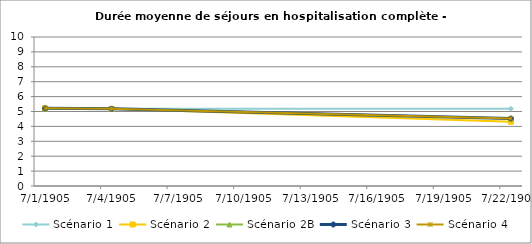
| Category | Scénario 1 | Scénario 2 | Scénario 2B | Scénario 3 | Scénario 4 |
|---|---|---|---|---|---|
| 2009.0 | 5.213 | 5.213 | 5.213 | 5.213 | 5.213 |
| 2012.0 | 5.177 | 5.177 | 5.177 | 5.177 | 5.177 |
| 2030.0 | 5.186 | 4.315 | 4.529 | 4.529 | 4.532 |